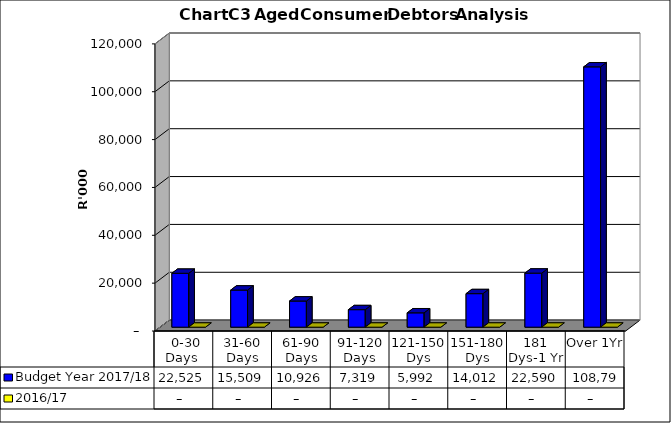
| Category | Budget Year 2017/18 | 2016/17 |
|---|---|---|
|  0-30 Days  | 22525091.6 | 0 |
| 31-60 Days | 15508676.04 | 0 |
| 61-90 Days | 10925519.09 | 0 |
| 91-120 Days | 7318746.3 | 0 |
| 121-150 Dys | 5992474.18 | 0 |
| 151-180 Dys | 14012139.32 | 0 |
| 181 Dys-1 Yr | 22589700.97 | 0 |
| Over 1Yr | 108797843.96 | 0 |